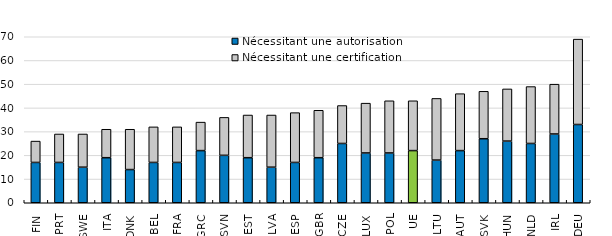
| Category | Nécessitant une autorisation | Nécessitant une certification |
|---|---|---|
| FIN | 17 | 9 |
| PRT | 17 | 12 |
| SWE | 15 | 14 |
| ITA | 19 | 12 |
| DNK | 14 | 17 |
| BEL | 17 | 15 |
| FRA | 17 | 15 |
| GRC | 22 | 12 |
| SVN | 20 | 16 |
| EST | 19 | 18 |
| LVA | 15 | 22 |
| ESP | 17 | 21 |
| GBR | 19 | 20 |
| CZE | 25 | 16 |
| LUX | 21 | 21 |
| POL | 21 | 22 |
| UE | 22 | 21 |
| LTU | 18 | 26 |
| AUT | 22 | 24 |
| SVK | 27 | 20 |
| HUN | 26 | 22 |
| NLD | 25 | 24 |
| IRL | 29 | 21 |
| DEU | 33 | 36 |